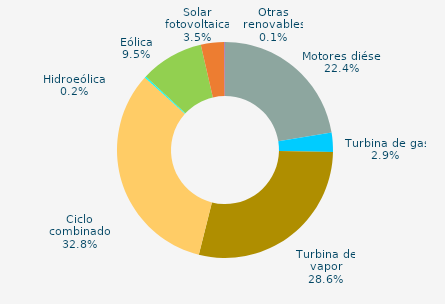
| Category | Series 0 |
|---|---|
| Motores diésel | 22.4 |
| Turbina de gas | 2.9 |
| Turbina de vapor | 28.6 |
| Ciclo combinado | 32.8 |
| Cogeneración | 0 |
| Hidráulica | 0 |
| Hidroeólica | 0.2 |
| Eólica | 9.5 |
| Solar fotovoltaica | 3.5 |
| Otras renovables | 0.1 |